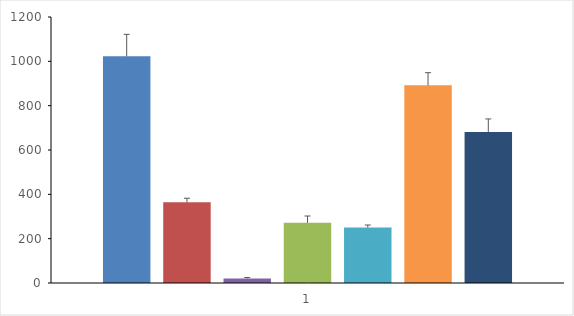
| Category | 5-HT(10-4 M) | TCB-2 (Agonista 5-HT2A) | BW723C86  (agonista 5-HT2B) | WAY161503 (agonista 5-HT2C) | MDL 100907 (Antagonista 5-HT2A) | RS 127445 (Antagonista 5-HT2B) | RS 10221 (Antagonista 5-HT2C) |
|---|---|---|---|---|---|---|---|
| 0 | 1022.52 | 364.091 | 20.379 | 271.852 | 250.028 | 891.589 | 681.488 |